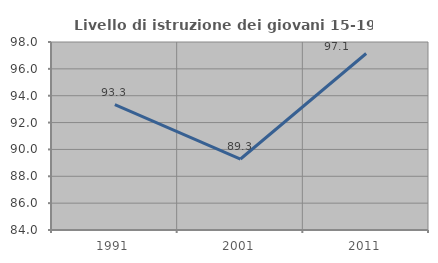
| Category | Livello di istruzione dei giovani 15-19 anni |
|---|---|
| 1991.0 | 93.333 |
| 2001.0 | 89.286 |
| 2011.0 | 97.143 |